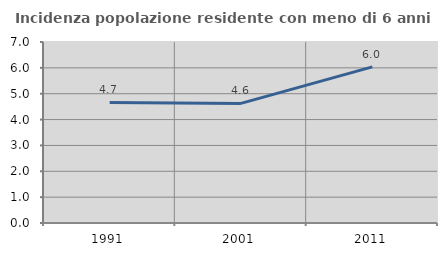
| Category | Incidenza popolazione residente con meno di 6 anni |
|---|---|
| 1991.0 | 4.661 |
| 2001.0 | 4.626 |
| 2011.0 | 6.04 |